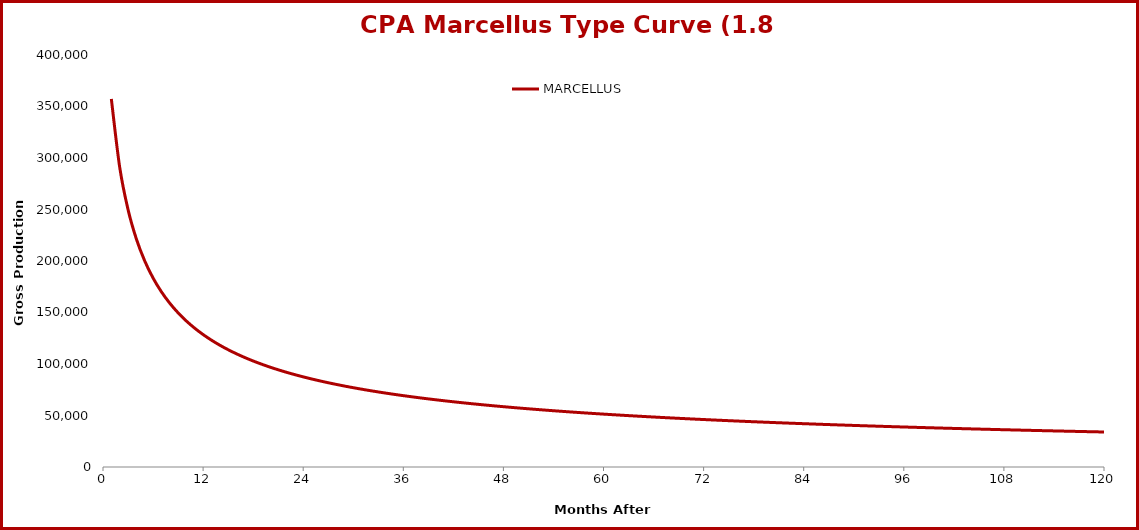
| Category | MARCELLUS |
|---|---|
| 1.0 | 357340 |
| 2.0 | 291135 |
| 3.0 | 249983 |
| 4.0 | 221382 |
| 5.0 | 200097 |
| 6.0 | 183503 |
| 7.0 | 170122 |
| 8.0 | 159052 |
| 9.0 | 149708 |
| 10.0 | 141691 |
| 11.0 | 134721 |
| 12.0 | 128591 |
| 13.0 | 123149 |
| 14.0 | 118278 |
| 15.0 | 113887 |
| 16.0 | 109902 |
| 17.0 | 106267 |
| 18.0 | 102935 |
| 19.0 | 99865 |
| 20.0 | 97027 |
| 21.0 | 94393 |
| 22.0 | 91941 |
| 23.0 | 89650 |
| 24.0 | 87505 |
| 25.0 | 85491 |
| 26.0 | 83595 |
| 27.0 | 81806 |
| 28.0 | 80116 |
| 29.0 | 78515 |
| 30.0 | 76996 |
| 31.0 | 75553 |
| 32.0 | 74179 |
| 33.0 | 72869 |
| 34.0 | 71619 |
| 35.0 | 70424 |
| 36.0 | 69281 |
| 37.0 | 68186 |
| 38.0 | 67135 |
| 39.0 | 66126 |
| 40.0 | 65156 |
| 41.0 | 64223 |
| 42.0 | 63325 |
| 43.0 | 62459 |
| 44.0 | 61624 |
| 45.0 | 60818 |
| 46.0 | 60039 |
| 47.0 | 59287 |
| 48.0 | 58558 |
| 49.0 | 57853 |
| 50.0 | 57170 |
| 51.0 | 56508 |
| 52.0 | 55866 |
| 53.0 | 55243 |
| 54.0 | 54637 |
| 55.0 | 54050 |
| 56.0 | 53478 |
| 57.0 | 52923 |
| 58.0 | 52382 |
| 59.0 | 51856 |
| 60.0 | 51343 |
| 61.0 | 50844 |
| 62.0 | 50358 |
| 63.0 | 49883 |
| 64.0 | 49420 |
| 65.0 | 48969 |
| 66.0 | 48528 |
| 67.0 | 48098 |
| 68.0 | 47677 |
| 69.0 | 47266 |
| 70.0 | 46865 |
| 71.0 | 46472 |
| 72.0 | 46088 |
| 73.0 | 45712 |
| 74.0 | 45345 |
| 75.0 | 44985 |
| 76.0 | 44632 |
| 77.0 | 44287 |
| 78.0 | 43948 |
| 79.0 | 43617 |
| 80.0 | 43292 |
| 81.0 | 42973 |
| 82.0 | 42661 |
| 83.0 | 42354 |
| 84.0 | 42053 |
| 85.0 | 41758 |
| 86.0 | 41468 |
| 87.0 | 41184 |
| 88.0 | 40904 |
| 89.0 | 40630 |
| 90.0 | 40360 |
| 91.0 | 40095 |
| 92.0 | 39835 |
| 93.0 | 39579 |
| 94.0 | 39327 |
| 95.0 | 39080 |
| 96.0 | 38837 |
| 97.0 | 38597 |
| 98.0 | 38362 |
| 99.0 | 38130 |
| 100.0 | 37902 |
| 101.0 | 37677 |
| 102.0 | 37457 |
| 103.0 | 37239 |
| 104.0 | 37025 |
| 105.0 | 36814 |
| 106.0 | 36606 |
| 107.0 | 36401 |
| 108.0 | 36199 |
| 109.0 | 36000 |
| 110.0 | 35804 |
| 111.0 | 35611 |
| 112.0 | 35421 |
| 113.0 | 35233 |
| 114.0 | 35048 |
| 115.0 | 34865 |
| 116.0 | 34685 |
| 117.0 | 34508 |
| 118.0 | 34332 |
| 119.0 | 34159 |
| 120.0 | 33989 |
| 121.0 | 33820 |
| 122.0 | 33654 |
| 123.0 | 33490 |
| 124.0 | 33328 |
| 125.0 | 33168 |
| 126.0 | 33010 |
| 127.0 | 32855 |
| 128.0 | 32701 |
| 129.0 | 32549 |
| 130.0 | 32398 |
| 131.0 | 32250 |
| 132.0 | 32103 |
| 133.0 | 31959 |
| 134.0 | 31815 |
| 135.0 | 31674 |
| 136.0 | 31534 |
| 137.0 | 31396 |
| 138.0 | 31259 |
| 139.0 | 31124 |
| 140.0 | 30991 |
| 141.0 | 30859 |
| 142.0 | 30727 |
| 143.0 | 30596 |
| 144.0 | 30466 |
| 145.0 | 30336 |
| 146.0 | 30206 |
| 147.0 | 30077 |
| 148.0 | 29949 |
| 149.0 | 29821 |
| 150.0 | 29694 |
| 151.0 | 29568 |
| 152.0 | 29441 |
| 153.0 | 29316 |
| 154.0 | 29191 |
| 155.0 | 29066 |
| 156.0 | 28942 |
| 157.0 | 28819 |
| 158.0 | 28696 |
| 159.0 | 28574 |
| 160.0 | 28452 |
| 161.0 | 28330 |
| 162.0 | 28209 |
| 163.0 | 28089 |
| 164.0 | 27969 |
| 165.0 | 27850 |
| 166.0 | 27731 |
| 167.0 | 27613 |
| 168.0 | 27495 |
| 169.0 | 27378 |
| 170.0 | 27261 |
| 171.0 | 27145 |
| 172.0 | 27029 |
| 173.0 | 26914 |
| 174.0 | 26799 |
| 175.0 | 26685 |
| 176.0 | 26571 |
| 177.0 | 26458 |
| 178.0 | 26345 |
| 179.0 | 26232 |
| 180.0 | 26120 |
| 181.0 | 26009 |
| 182.0 | 25898 |
| 183.0 | 25788 |
| 184.0 | 25678 |
| 185.0 | 25568 |
| 186.0 | 25459 |
| 187.0 | 25350 |
| 188.0 | 25242 |
| 189.0 | 25135 |
| 190.0 | 25027 |
| 191.0 | 24921 |
| 192.0 | 24814 |
| 193.0 | 24709 |
| 194.0 | 24603 |
| 195.0 | 24498 |
| 196.0 | 24394 |
| 197.0 | 24290 |
| 198.0 | 24186 |
| 199.0 | 24083 |
| 200.0 | 23980 |
| 201.0 | 23878 |
| 202.0 | 23776 |
| 203.0 | 23675 |
| 204.0 | 23574 |
| 205.0 | 23473 |
| 206.0 | 23373 |
| 207.0 | 23273 |
| 208.0 | 23174 |
| 209.0 | 23075 |
| 210.0 | 22977 |
| 211.0 | 22879 |
| 212.0 | 22781 |
| 213.0 | 22684 |
| 214.0 | 22587 |
| 215.0 | 22491 |
| 216.0 | 22395 |
| 217.0 | 22299 |
| 218.0 | 22204 |
| 219.0 | 22110 |
| 220.0 | 22015 |
| 221.0 | 21921 |
| 222.0 | 21828 |
| 223.0 | 21735 |
| 224.0 | 21642 |
| 225.0 | 21550 |
| 226.0 | 21458 |
| 227.0 | 21366 |
| 228.0 | 21275 |
| 229.0 | 21185 |
| 230.0 | 21094 |
| 231.0 | 21004 |
| 232.0 | 20915 |
| 233.0 | 20825 |
| 234.0 | 20737 |
| 235.0 | 20648 |
| 236.0 | 20560 |
| 237.0 | 20472 |
| 238.0 | 20385 |
| 239.0 | 20298 |
| 240.0 | 20211 |
| 241.0 | 20125 |
| 242.0 | 20039 |
| 243.0 | 19954 |
| 244.0 | 19869 |
| 245.0 | 19784 |
| 246.0 | 19700 |
| 247.0 | 19616 |
| 248.0 | 19532 |
| 249.0 | 19449 |
| 250.0 | 19366 |
| 251.0 | 19283 |
| 252.0 | 19201 |
| 253.0 | 19119 |
| 254.0 | 19037 |
| 255.0 | 18956 |
| 256.0 | 18875 |
| 257.0 | 18795 |
| 258.0 | 18715 |
| 259.0 | 18635 |
| 260.0 | 18555 |
| 261.0 | 18476 |
| 262.0 | 18397 |
| 263.0 | 18319 |
| 264.0 | 18241 |
| 265.0 | 18163 |
| 266.0 | 18086 |
| 267.0 | 18008 |
| 268.0 | 17932 |
| 269.0 | 17855 |
| 270.0 | 17779 |
| 271.0 | 17703 |
| 272.0 | 17628 |
| 273.0 | 17552 |
| 274.0 | 17478 |
| 275.0 | 17403 |
| 276.0 | 17329 |
| 277.0 | 17255 |
| 278.0 | 17181 |
| 279.0 | 17108 |
| 280.0 | 17035 |
| 281.0 | 16962 |
| 282.0 | 16890 |
| 283.0 | 16818 |
| 284.0 | 16746 |
| 285.0 | 16675 |
| 286.0 | 16604 |
| 287.0 | 16533 |
| 288.0 | 16462 |
| 289.0 | 16392 |
| 290.0 | 16322 |
| 291.0 | 16253 |
| 292.0 | 16183 |
| 293.0 | 16114 |
| 294.0 | 16046 |
| 295.0 | 15977 |
| 296.0 | 15909 |
| 297.0 | 15841 |
| 298.0 | 15774 |
| 299.0 | 15706 |
| 300.0 | 15639 |
| 301.0 | 15573 |
| 302.0 | 15506 |
| 303.0 | 15440 |
| 304.0 | 15374 |
| 305.0 | 15309 |
| 306.0 | 15243 |
| 307.0 | 15178 |
| 308.0 | 15114 |
| 309.0 | 15049 |
| 310.0 | 14985 |
| 311.0 | 14921 |
| 312.0 | 14857 |
| 313.0 | 14794 |
| 314.0 | 14731 |
| 315.0 | 14668 |
| 316.0 | 14605 |
| 317.0 | 14543 |
| 318.0 | 14481 |
| 319.0 | 14419 |
| 320.0 | 14358 |
| 321.0 | 14297 |
| 322.0 | 14236 |
| 323.0 | 14175 |
| 324.0 | 14114 |
| 325.0 | 14054 |
| 326.0 | 13994 |
| 327.0 | 13935 |
| 328.0 | 13875 |
| 329.0 | 13816 |
| 330.0 | 13757 |
| 331.0 | 13698 |
| 332.0 | 13640 |
| 333.0 | 13582 |
| 334.0 | 13524 |
| 335.0 | 13466 |
| 336.0 | 13409 |
| 337.0 | 13352 |
| 338.0 | 13295 |
| 339.0 | 13238 |
| 340.0 | 13181 |
| 341.0 | 13125 |
| 342.0 | 13069 |
| 343.0 | 13013 |
| 344.0 | 12958 |
| 345.0 | 12903 |
| 346.0 | 12848 |
| 347.0 | 12793 |
| 348.0 | 12738 |
| 349.0 | 12684 |
| 350.0 | 12630 |
| 351.0 | 12576 |
| 352.0 | 12522 |
| 353.0 | 12469 |
| 354.0 | 12416 |
| 355.0 | 12363 |
| 356.0 | 12310 |
| 357.0 | 12258 |
| 358.0 | 12205 |
| 359.0 | 12153 |
| 360.0 | 12101 |
| 361.0 | 12050 |
| 362.0 | 11998 |
| 363.0 | 11947 |
| 364.0 | 11896 |
| 365.0 | 11845 |
| 366.0 | 11795 |
| 367.0 | 11745 |
| 368.0 | 11695 |
| 369.0 | 11645 |
| 370.0 | 11595 |
| 371.0 | 11546 |
| 372.0 | 11496 |
| 373.0 | 11447 |
| 374.0 | 11398 |
| 375.0 | 11350 |
| 376.0 | 11301 |
| 377.0 | 11253 |
| 378.0 | 11205 |
| 379.0 | 11157 |
| 380.0 | 11110 |
| 381.0 | 11062 |
| 382.0 | 11015 |
| 383.0 | 10968 |
| 384.0 | 10921 |
| 385.0 | 10875 |
| 386.0 | 10829 |
| 387.0 | 10782 |
| 388.0 | 10736 |
| 389.0 | 10691 |
| 390.0 | 10645 |
| 391.0 | 10600 |
| 392.0 | 10554 |
| 393.0 | 10509 |
| 394.0 | 10464 |
| 395.0 | 10420 |
| 396.0 | 10375 |
| 397.0 | 10331 |
| 398.0 | 10287 |
| 399.0 | 10243 |
| 400.0 | 10200 |
| 401.0 | 10156 |
| 402.0 | 10113 |
| 403.0 | 10070 |
| 404.0 | 10027 |
| 405.0 | 9984 |
| 406.0 | 9941 |
| 407.0 | 9899 |
| 408.0 | 9857 |
| 409.0 | 9815 |
| 410.0 | 9773 |
| 411.0 | 9731 |
| 412.0 | 9690 |
| 413.0 | 9648 |
| 414.0 | 9607 |
| 415.0 | 9566 |
| 416.0 | 9525 |
| 417.0 | 9485 |
| 418.0 | 9444 |
| 419.0 | 9404 |
| 420.0 | 9364 |
| 421.0 | 9324 |
| 422.0 | 9284 |
| 423.0 | 9245 |
| 424.0 | 9205 |
| 425.0 | 9166 |
| 426.0 | 9127 |
| 427.0 | 9088 |
| 428.0 | 9049 |
| 429.0 | 9010 |
| 430.0 | 8972 |
| 431.0 | 8934 |
| 432.0 | 8896 |
| 433.0 | 8858 |
| 434.0 | 8820 |
| 435.0 | 8782 |
| 436.0 | 8745 |
| 437.0 | 8708 |
| 438.0 | 8670 |
| 439.0 | 8633 |
| 440.0 | 8597 |
| 441.0 | 8560 |
| 442.0 | 8523 |
| 443.0 | 8487 |
| 444.0 | 8451 |
| 445.0 | 8415 |
| 446.0 | 8379 |
| 447.0 | 8343 |
| 448.0 | 8308 |
| 449.0 | 8272 |
| 450.0 | 8237 |
| 451.0 | 8202 |
| 452.0 | 8167 |
| 453.0 | 8132 |
| 454.0 | 8097 |
| 455.0 | 8063 |
| 456.0 | 8028 |
| 457.0 | 7994 |
| 458.0 | 7960 |
| 459.0 | 7926 |
| 460.0 | 7892 |
| 461.0 | 7859 |
| 462.0 | 7825 |
| 463.0 | 7792 |
| 464.0 | 7758 |
| 465.0 | 7725 |
| 466.0 | 7692 |
| 467.0 | 7660 |
| 468.0 | 7627 |
| 469.0 | 7594 |
| 470.0 | 7562 |
| 471.0 | 7530 |
| 472.0 | 7498 |
| 473.0 | 7466 |
| 474.0 | 7434 |
| 475.0 | 7402 |
| 476.0 | 7370 |
| 477.0 | 7339 |
| 478.0 | 7308 |
| 479.0 | 7277 |
| 480.0 | 7246 |
| 481.0 | 7215 |
| 482.0 | 7184 |
| 483.0 | 7153 |
| 484.0 | 7123 |
| 485.0 | 7092 |
| 486.0 | 7062 |
| 487.0 | 7032 |
| 488.0 | 7002 |
| 489.0 | 6972 |
| 490.0 | 6942 |
| 491.0 | 6913 |
| 492.0 | 6883 |
| 493.0 | 6854 |
| 494.0 | 6825 |
| 495.0 | 6796 |
| 496.0 | 6767 |
| 497.0 | 6738 |
| 498.0 | 6709 |
| 499.0 | 6680 |
| 500.0 | 6652 |
| 501.0 | 6623 |
| 502.0 | 6595 |
| 503.0 | 6567 |
| 504.0 | 6539 |
| 505.0 | 6511 |
| 506.0 | 6483 |
| 507.0 | 6456 |
| 508.0 | 6428 |
| 509.0 | 6401 |
| 510.0 | 6374 |
| 511.0 | 6346 |
| 512.0 | 6319 |
| 513.0 | 6292 |
| 514.0 | 6265 |
| 515.0 | 6239 |
| 516.0 | 6212 |
| 517.0 | 6186 |
| 518.0 | 6159 |
| 519.0 | 6133 |
| 520.0 | 6107 |
| 521.0 | 6081 |
| 522.0 | 6055 |
| 523.0 | 6029 |
| 524.0 | 6003 |
| 525.0 | 5978 |
| 526.0 | 5952 |
| 527.0 | 5927 |
| 528.0 | 5902 |
| 529.0 | 5876 |
| 530.0 | 5851 |
| 531.0 | 5826 |
| 532.0 | 5801 |
| 533.0 | 5777 |
| 534.0 | 5752 |
| 535.0 | 5728 |
| 536.0 | 5703 |
| 537.0 | 5679 |
| 538.0 | 5655 |
| 539.0 | 5630 |
| 540.0 | 5606 |
| 541.0 | 5583 |
| 542.0 | 5559 |
| 543.0 | 5535 |
| 544.0 | 5511 |
| 545.0 | 5488 |
| 546.0 | 5465 |
| 547.0 | 5441 |
| 548.0 | 5418 |
| 549.0 | 5395 |
| 550.0 | 5372 |
| 551.0 | 5349 |
| 552.0 | 5326 |
| 553.0 | 5303 |
| 554.0 | 5281 |
| 555.0 | 5258 |
| 556.0 | 5236 |
| 557.0 | 5214 |
| 558.0 | 5191 |
| 559.0 | 5169 |
| 560.0 | 5147 |
| 561.0 | 5125 |
| 562.0 | 5103 |
| 563.0 | 5082 |
| 564.0 | 5060 |
| 565.0 | 5038 |
| 566.0 | 5017 |
| 567.0 | 4995 |
| 568.0 | 4974 |
| 569.0 | 4953 |
| 570.0 | 4932 |
| 571.0 | 4911 |
| 572.0 | 4890 |
| 573.0 | 4869 |
| 574.0 | 4848 |
| 575.0 | 4827 |
| 576.0 | 4807 |
| 577.0 | 4786 |
| 578.0 | 4766 |
| 579.0 | 4746 |
| 580.0 | 4725 |
| 581.0 | 4705 |
| 582.0 | 4685 |
| 583.0 | 4665 |
| 584.0 | 4645 |
| 585.0 | 4625 |
| 586.0 | 4606 |
| 587.0 | 4586 |
| 588.0 | 4567 |
| 589.0 | 4547 |
| 590.0 | 4528 |
| 591.0 | 4508 |
| 592.0 | 4489 |
| 593.0 | 4470 |
| 594.0 | 4451 |
| 595.0 | 4432 |
| 596.0 | 4413 |
| 597.0 | 4394 |
| 598.0 | 4375 |
| 599.0 | 4357 |
| 600.0 | 4338 |
| 601.0 | 4320 |
| 602.0 | 4301 |
| 603.0 | 4283 |
| 604.0 | 4265 |
| 605.0 | 4246 |
| 606.0 | 4228 |
| 607.0 | 4210 |
| 608.0 | 4192 |
| 609.0 | 4174 |
| 610.0 | 4157 |
| 611.0 | 4139 |
| 612.0 | 4121 |
| 613.0 | 4104 |
| 614.0 | 4086 |
| 615.0 | 4069 |
| 616.0 | 4051 |
| 617.0 | 4034 |
| 618.0 | 4017 |
| 619.0 | 4000 |
| 620.0 | 3983 |
| 621.0 | 3966 |
| 622.0 | 3949 |
| 623.0 | 3932 |
| 624.0 | 3915 |
| 625.0 | 3899 |
| 626.0 | 3882 |
| 627.0 | 3865 |
| 628.0 | 3849 |
| 629.0 | 3832 |
| 630.0 | 3816 |
| 631.0 | 3800 |
| 632.0 | 3784 |
| 633.0 | 3767 |
| 634.0 | 3751 |
| 635.0 | 3735 |
| 636.0 | 3719 |
| 637.0 | 3704 |
| 638.0 | 3688 |
| 639.0 | 3672 |
| 640.0 | 3656 |
| 641.0 | 3641 |
| 642.0 | 3625 |
| 643.0 | 3610 |
| 644.0 | 3594 |
| 645.0 | 3579 |
| 646.0 | 3564 |
| 647.0 | 3549 |
| 648.0 | 3533 |
| 649.0 | 3518 |
| 650.0 | 3503 |
| 651.0 | 3488 |
| 652.0 | 3474 |
| 653.0 | 3459 |
| 654.0 | 3444 |
| 655.0 | 3429 |
| 656.0 | 3415 |
| 657.0 | 3400 |
| 658.0 | 3386 |
| 659.0 | 3371 |
| 660.0 | 3357 |
| 661.0 | 3342 |
| 662.0 | 3328 |
| 663.0 | 3314 |
| 664.0 | 3300 |
| 665.0 | 3286 |
| 666.0 | 3272 |
| 667.0 | 3258 |
| 668.0 | 3244 |
| 669.0 | 3230 |
| 670.0 | 3216 |
| 671.0 | 3203 |
| 672.0 | 3189 |
| 673.0 | 3175 |
| 674.0 | 3162 |
| 675.0 | 3148 |
| 676.0 | 3135 |
| 677.0 | 3122 |
| 678.0 | 3108 |
| 679.0 | 3095 |
| 680.0 | 3082 |
| 681.0 | 3069 |
| 682.0 | 3056 |
| 683.0 | 3042 |
| 684.0 | 3030 |
| 685.0 | 3017 |
| 686.0 | 3004 |
| 687.0 | 2991 |
| 688.0 | 2978 |
| 689.0 | 2965 |
| 690.0 | 2953 |
| 691.0 | 2940 |
| 692.0 | 2928 |
| 693.0 | 2915 |
| 694.0 | 2903 |
| 695.0 | 2890 |
| 696.0 | 2878 |
| 697.0 | 2866 |
| 698.0 | 2854 |
| 699.0 | 2841 |
| 700.0 | 2829 |
| 701.0 | 2817 |
| 702.0 | 2805 |
| 703.0 | 2793 |
| 704.0 | 2781 |
| 705.0 | 2769 |
| 706.0 | 2758 |
| 707.0 | 2746 |
| 708.0 | 2734 |
| 709.0 | 2722 |
| 710.0 | 2711 |
| 711.0 | 2699 |
| 712.0 | 2688 |
| 713.0 | 2676 |
| 714.0 | 2665 |
| 715.0 | 2654 |
| 716.0 | 2642 |
| 717.0 | 2631 |
| 718.0 | 2620 |
| 719.0 | 2609 |
| 720.0 | 2597 |
| 721.0 | 2586 |
| 722.0 | 2575 |
| 723.0 | 2564 |
| 724.0 | 2553 |
| 725.0 | 2543 |
| 726.0 | 2532 |
| 727.0 | 2521 |
| 728.0 | 2510 |
| 729.0 | 2499 |
| 730.0 | 2489 |
| 731.0 | 2478 |
| 732.0 | 2468 |
| 733.0 | 2457 |
| 734.0 | 2447 |
| 735.0 | 2436 |
| 736.0 | 2426 |
| 737.0 | 2415 |
| 738.0 | 2405 |
| 739.0 | 2395 |
| 740.0 | 2385 |
| 741.0 | 2374 |
| 742.0 | 2364 |
| 743.0 | 2354 |
| 744.0 | 2344 |
| 745.0 | 2334 |
| 746.0 | 2324 |
| 747.0 | 2314 |
| 748.0 | 2304 |
| 749.0 | 2295 |
| 750.0 | 2285 |
| 751.0 | 2275 |
| 752.0 | 2265 |
| 753.0 | 2256 |
| 754.0 | 2246 |
| 755.0 | 2237 |
| 756.0 | 2227 |
| 757.0 | 2217 |
| 758.0 | 2208 |
| 759.0 | 2199 |
| 760.0 | 2189 |
| 761.0 | 2180 |
| 762.0 | 2171 |
| 763.0 | 2161 |
| 764.0 | 2152 |
| 765.0 | 2143 |
| 766.0 | 2134 |
| 767.0 | 2125 |
| 768.0 | 2116 |
| 769.0 | 2107 |
| 770.0 | 2098 |
| 771.0 | 2089 |
| 772.0 | 2080 |
| 773.0 | 2071 |
| 774.0 | 2062 |
| 775.0 | 2053 |
| 776.0 | 2045 |
| 777.0 | 2036 |
| 778.0 | 2027 |
| 779.0 | 2018 |
| 780.0 | 2010 |